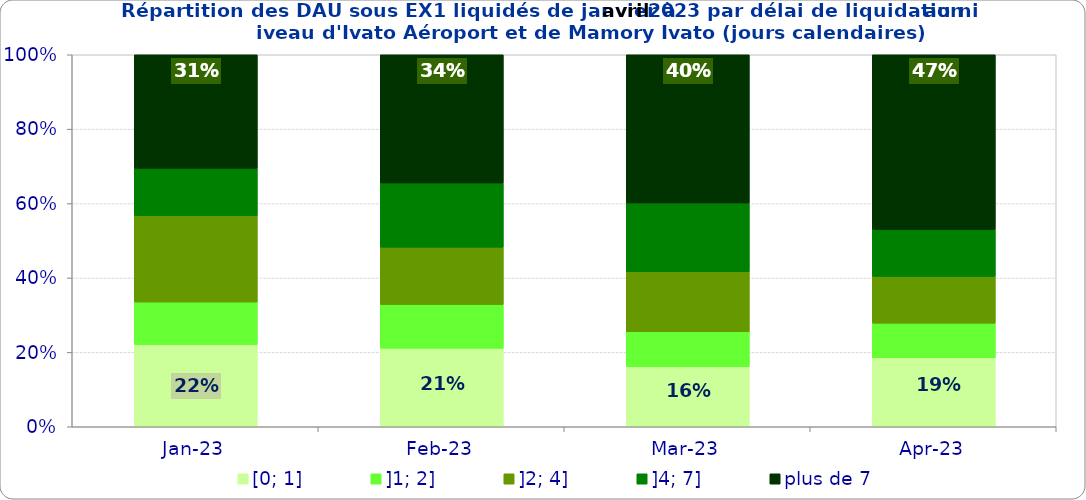
| Category | [0; 1] | ]1; 2] | ]2; 4] | ]4; 7] | plus de 7 |
|---|---|---|---|---|---|
| 2023-01-01 | 0.221 | 0.114 | 0.232 | 0.127 | 0.305 |
| 2023-02-01 | 0.211 | 0.117 | 0.154 | 0.172 | 0.345 |
| 2023-03-01 | 0.161 | 0.094 | 0.161 | 0.185 | 0.399 |
| 2023-04-01 | 0.186 | 0.093 | 0.126 | 0.126 | 0.47 |